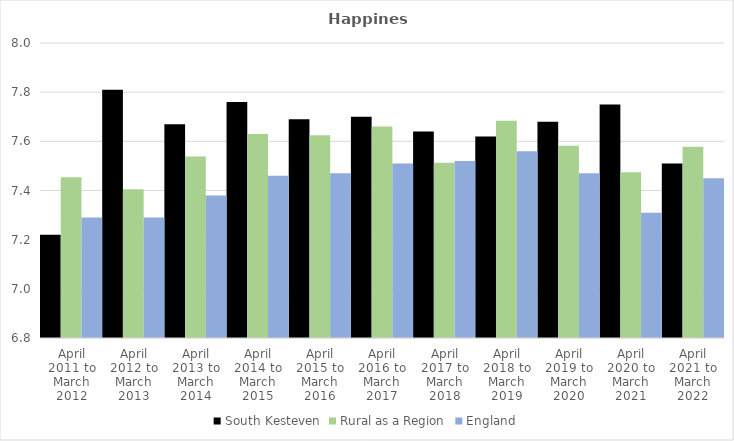
| Category | South Kesteven | Rural as a Region | England |
|---|---|---|---|
| April 2011 to March 2012 | 7.22 | 7.454 | 7.29 |
| April 2012 to March 2013 | 7.81 | 7.406 | 7.29 |
| April 2013 to March 2014 | 7.67 | 7.539 | 7.38 |
| April 2014 to March 2015 | 7.76 | 7.63 | 7.46 |
| April 2015 to March 2016 | 7.69 | 7.625 | 7.47 |
| April 2016 to March 2017 | 7.7 | 7.661 | 7.51 |
| April 2017 to March 2018 | 7.64 | 7.513 | 7.52 |
| April 2018 to March 2019 | 7.62 | 7.684 | 7.56 |
| April 2019 to March 2020 | 7.68 | 7.582 | 7.47 |
| April 2020 to March 2021 | 7.75 | 7.474 | 7.31 |
| April 2021 to March 2022 | 7.51 | 7.577 | 7.45 |